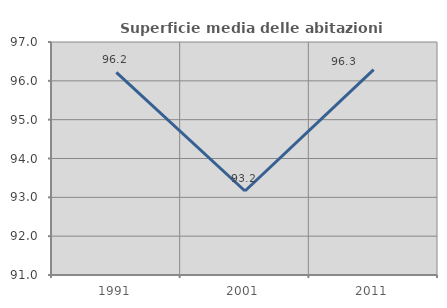
| Category | Superficie media delle abitazioni occupate |
|---|---|
| 1991.0 | 96.217 |
| 2001.0 | 93.163 |
| 2011.0 | 96.288 |